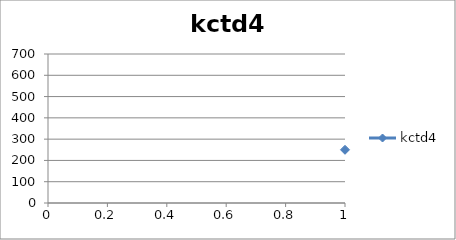
| Category | kctd4 |
|---|---|
| 0 | 250 |
| 1 | 597 |
| 2 | 264 |
| 3 | 94 |
| 4 | 48 |
| 5 | 347 |
| 6 | 55 |
| 7 | 29 |
| 8 | 30 |
| 9 | 16 |
| 10 | 4 |